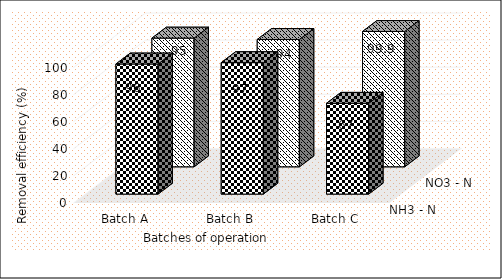
| Category | NH3 - N | NO3 - N |
|---|---|---|
| Batch A | 96 | 95 |
| Batch B | 97 | 94 |
| Batch C | 67 | 99.9 |